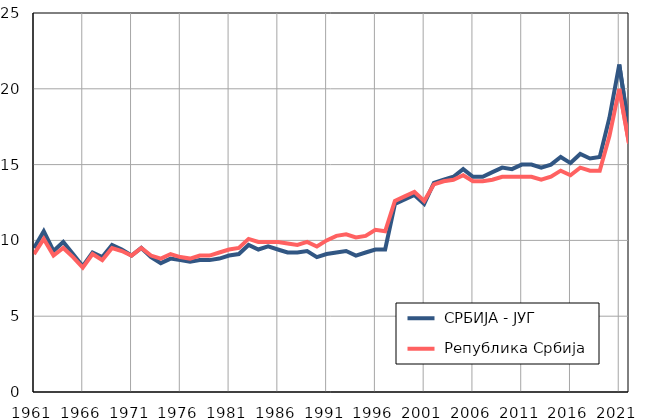
| Category |  СРБИЈА - ЈУГ |  Република Србија |
|---|---|---|
| 1961.0 | 9.5 | 9.1 |
| 1962.0 | 10.6 | 10.1 |
| 1963.0 | 9.3 | 9 |
| 1964.0 | 9.9 | 9.5 |
| 1965.0 | 9.1 | 8.9 |
| 1966.0 | 8.3 | 8.2 |
| 1967.0 | 9.2 | 9.1 |
| 1968.0 | 8.9 | 8.7 |
| 1969.0 | 9.7 | 9.5 |
| 1970.0 | 9.4 | 9.3 |
| 1971.0 | 9 | 9 |
| 1972.0 | 9.5 | 9.5 |
| 1973.0 | 8.9 | 9 |
| 1974.0 | 8.5 | 8.8 |
| 1975.0 | 8.8 | 9.1 |
| 1976.0 | 8.7 | 8.9 |
| 1977.0 | 8.6 | 8.8 |
| 1978.0 | 8.7 | 9 |
| 1979.0 | 8.7 | 9 |
| 1980.0 | 8.8 | 9.2 |
| 1981.0 | 9 | 9.4 |
| 1982.0 | 9.1 | 9.5 |
| 1983.0 | 9.7 | 10.1 |
| 1984.0 | 9.4 | 9.9 |
| 1985.0 | 9.6 | 9.9 |
| 1986.0 | 9.4 | 9.9 |
| 1987.0 | 9.2 | 9.8 |
| 1988.0 | 9.2 | 9.7 |
| 1989.0 | 9.3 | 9.9 |
| 1990.0 | 8.9 | 9.6 |
| 1991.0 | 9.1 | 10 |
| 1992.0 | 9.2 | 10.3 |
| 1993.0 | 9.3 | 10.4 |
| 1994.0 | 9 | 10.2 |
| 1995.0 | 9.2 | 10.3 |
| 1996.0 | 9.4 | 10.7 |
| 1997.0 | 9.4 | 10.6 |
| 1998.0 | 12.4 | 12.6 |
| 1999.0 | 12.7 | 12.9 |
| 2000.0 | 13 | 13.2 |
| 2001.0 | 12.4 | 12.6 |
| 2002.0 | 13.8 | 13.7 |
| 2003.0 | 14 | 13.9 |
| 2004.0 | 14.2 | 14 |
| 2005.0 | 14.7 | 14.3 |
| 2006.0 | 14.2 | 13.9 |
| 2007.0 | 14.2 | 13.9 |
| 2008.0 | 14.5 | 14 |
| 2009.0 | 14.8 | 14.2 |
| 2010.0 | 14.7 | 14.2 |
| 2011.0 | 15 | 14.2 |
| 2012.0 | 15 | 14.2 |
| 2013.0 | 14.8 | 14 |
| 2014.0 | 15 | 14.2 |
| 2015.0 | 15.5 | 14.6 |
| 2016.0 | 15.1 | 14.3 |
| 2017.0 | 15.7 | 14.8 |
| 2018.0 | 15.4 | 14.6 |
| 2019.0 | 15.5 | 14.6 |
| 2020.0 | 18.1 | 16.9 |
| 2021.0 | 21.6 | 20 |
| 2022.0 | 17.3 | 16.4 |